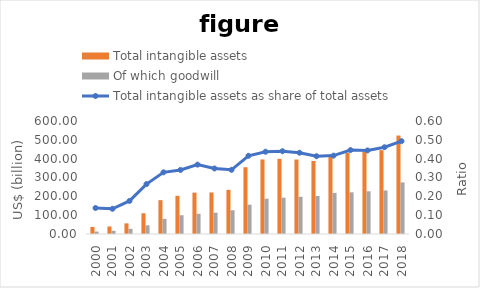
| Category | Total intangible assets | Of which goodwill |
|---|---|---|
| 2000.0 | 37.62 | 12.861 |
| 2001.0 | 40.001 | 16.984 |
| 2002.0 | 56.439 | 27.352 |
| 2003.0 | 110.269 | 46.077 |
| 2004.0 | 179.703 | 80.312 |
| 2005.0 | 202.776 | 99.553 |
| 2006.0 | 219.787 | 107.492 |
| 2007.0 | 220.598 | 113.023 |
| 2008.0 | 234.467 | 126.077 |
| 2009.0 | 354.555 | 155.656 |
| 2010.0 | 395.788 | 187.399 |
| 2011.0 | 399.297 | 192.731 |
| 2012.0 | 395.362 | 197.7 |
| 2013.0 | 387.997 | 201.836 |
| 2014.0 | 412.16 | 218.434 |
| 2015.0 | 431.315 | 221.337 |
| 2016.0 | 435.668 | 226.8 |
| 2017.0 | 445.005 | 231.31 |
| 2018.0 | 522.796 | 274.045 |